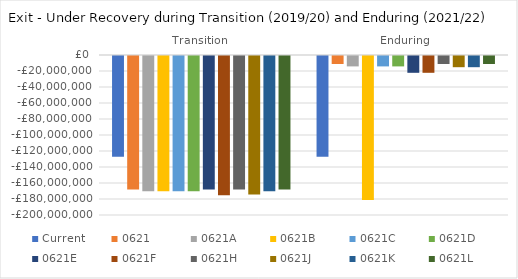
| Category | Current | 0621 | 0621A | 0621B | 0621C | 0621D | 0621E | 0621F | 0621H | 0621J | 0621K | 0621L |
|---|---|---|---|---|---|---|---|---|---|---|---|---|
| Transition | -126000000 | -167000000 | -169000000 | -169000000 | -169000000 | -169000000 | -167000000 | -174000000 | -167000000 | -173000000 | -169000000 | -167000000 |
| Enduring | -126000000 | -10000000 | -13000000 | -180000000 | -13000000 | -13000000 | -21000000 | -21000000 | -10000000 | -14000000 | -14000000 | -10000000 |